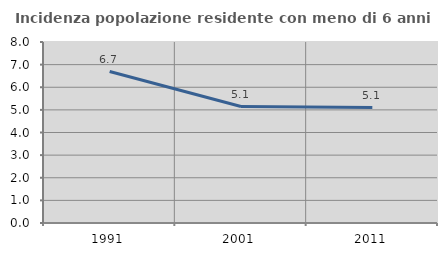
| Category | Incidenza popolazione residente con meno di 6 anni |
|---|---|
| 1991.0 | 6.696 |
| 2001.0 | 5.148 |
| 2011.0 | 5.101 |